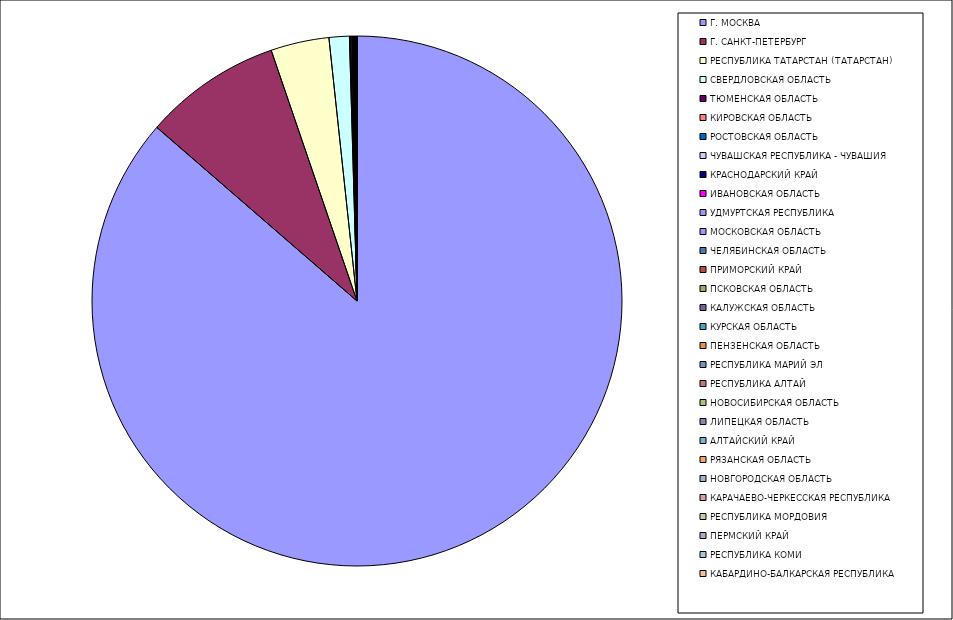
| Category | Оборот |
|---|---|
| Г. МОСКВА | 86.358 |
| Г. САНКТ-ПЕТЕРБУРГ | 8.382 |
| РЕСПУБЛИКА ТАТАРСТАН (ТАТАРСТАН) | 3.556 |
| СВЕРДЛОВСКАЯ ОБЛАСТЬ | 1.235 |
| ТЮМЕНСКАЯ ОБЛАСТЬ | 0.075 |
| КИРОВСКАЯ ОБЛАСТЬ | 0.071 |
| РОСТОВСКАЯ ОБЛАСТЬ | 0.042 |
| ЧУВАШСКАЯ РЕСПУБЛИКА - ЧУВАШИЯ | 0.033 |
| КРАСНОДАРСКИЙ КРАЙ | 0.027 |
| ИВАНОВСКАЯ ОБЛАСТЬ | 0.024 |
| УДМУРТСКАЯ РЕСПУБЛИКА | 0.022 |
| МОСКОВСКАЯ ОБЛАСТЬ | 0.02 |
| ЧЕЛЯБИНСКАЯ ОБЛАСТЬ | 0.019 |
| ПРИМОРСКИЙ КРАЙ | 0.019 |
| ПСКОВСКАЯ ОБЛАСТЬ | 0.016 |
| КАЛУЖСКАЯ ОБЛАСТЬ | 0.016 |
| КУРСКАЯ ОБЛАСТЬ | 0.013 |
| ПЕНЗЕНСКАЯ ОБЛАСТЬ | 0.01 |
| РЕСПУБЛИКА МАРИЙ ЭЛ | 0.008 |
| РЕСПУБЛИКА АЛТАЙ | 0.005 |
| НОВОСИБИРСКАЯ ОБЛАСТЬ | 0.005 |
| ЛИПЕЦКАЯ ОБЛАСТЬ | 0.005 |
| АЛТАЙСКИЙ КРАЙ | 0.004 |
| РЯЗАНСКАЯ ОБЛАСТЬ | 0.004 |
| НОВГОРОДСКАЯ ОБЛАСТЬ | 0.004 |
| КАРАЧАЕВО-ЧЕРКЕССКАЯ РЕСПУБЛИКА | 0.003 |
| РЕСПУБЛИКА МОРДОВИЯ | 0.003 |
| ПЕРМСКИЙ КРАЙ | 0.003 |
| РЕСПУБЛИКА КОМИ | 0.003 |
| КАБАРДИНО-БАЛКАРСКАЯ РЕСПУБЛИКА | 0.003 |